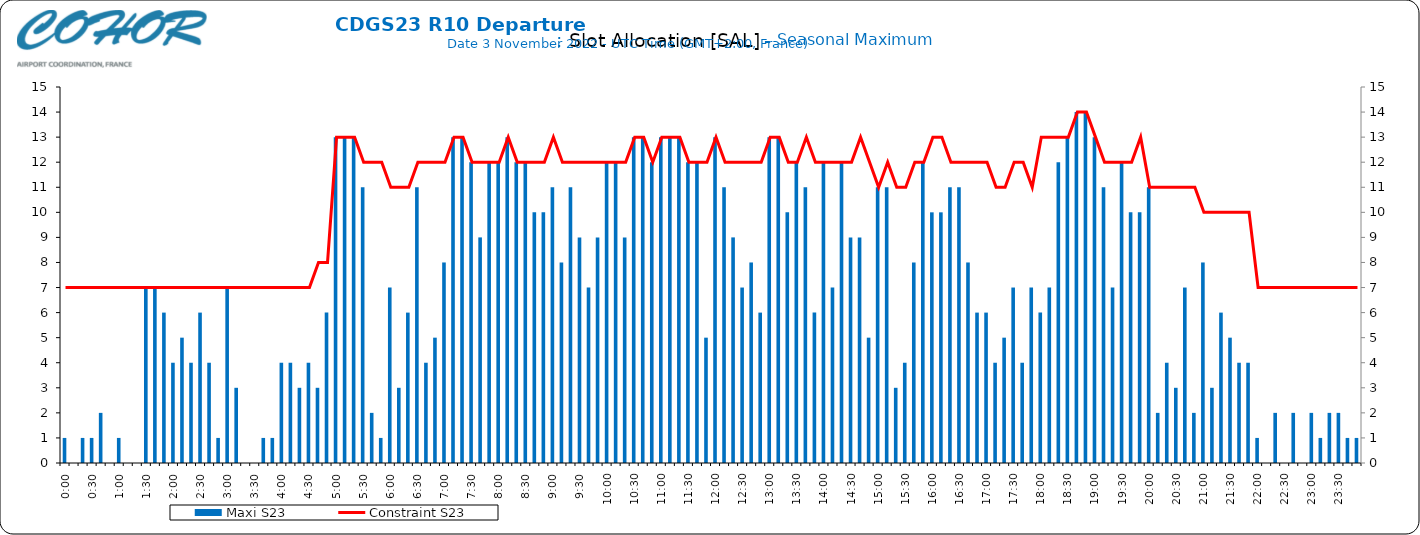
| Category | Maxi S23 |
|---|---|
| 0.0 | 1 |
| 0.006944444444444444 | 0 |
| 0.013888888888888888 | 1 |
| 0.020833333333333332 | 1 |
| 0.027777777777777776 | 2 |
| 0.034722222222222224 | 0 |
| 0.041666666666666664 | 1 |
| 0.04861111111111111 | 0 |
| 0.05555555555555555 | 0 |
| 0.0625 | 7 |
| 0.06944444444444443 | 7 |
| 0.0763888888888889 | 6 |
| 0.08333333333333333 | 4 |
| 0.09027777777777778 | 5 |
| 0.09722222222222222 | 4 |
| 0.10416666666666667 | 6 |
| 0.1111111111111111 | 4 |
| 0.11805555555555557 | 1 |
| 0.125 | 7 |
| 0.13194444444444445 | 3 |
| 0.1388888888888889 | 0 |
| 0.14583333333333334 | 0 |
| 0.15277777777777776 | 1 |
| 0.15972222222222224 | 1 |
| 0.16666666666666666 | 4 |
| 0.17361111111111113 | 4 |
| 0.18055555555555555 | 3 |
| 0.1875 | 4 |
| 0.19444444444444445 | 3 |
| 0.20138888888888887 | 6 |
| 0.20833333333333334 | 13 |
| 0.2152777777777778 | 13 |
| 0.2222222222222222 | 13 |
| 0.22916666666666666 | 11 |
| 0.23611111111111113 | 2 |
| 0.24305555555555555 | 1 |
| 0.25 | 7 |
| 0.2569444444444445 | 3 |
| 0.2638888888888889 | 6 |
| 0.2708333333333333 | 11 |
| 0.2777777777777778 | 4 |
| 0.2847222222222222 | 5 |
| 0.2916666666666667 | 8 |
| 0.2986111111111111 | 13 |
| 0.3055555555555555 | 13 |
| 0.3125 | 12 |
| 0.3194444444444445 | 9 |
| 0.3263888888888889 | 12 |
| 0.3333333333333333 | 12 |
| 0.34027777777777773 | 13 |
| 0.34722222222222227 | 12 |
| 0.3541666666666667 | 12 |
| 0.3611111111111111 | 10 |
| 0.3680555555555556 | 10 |
| 0.375 | 11 |
| 0.3819444444444444 | 8 |
| 0.3888888888888889 | 11 |
| 0.3958333333333333 | 9 |
| 0.40277777777777773 | 7 |
| 0.40972222222222227 | 9 |
| 0.4166666666666667 | 12 |
| 0.4236111111111111 | 12 |
| 0.4305555555555556 | 9 |
| 0.4375 | 13 |
| 0.4444444444444444 | 13 |
| 0.4513888888888889 | 12 |
| 0.4583333333333333 | 13 |
| 0.46527777777777773 | 13 |
| 0.47222222222222227 | 13 |
| 0.4791666666666667 | 12 |
| 0.4861111111111111 | 12 |
| 0.4930555555555556 | 5 |
| 0.5 | 13 |
| 0.5069444444444444 | 11 |
| 0.513888888888889 | 9 |
| 0.5208333333333334 | 7 |
| 0.5277777777777778 | 8 |
| 0.5347222222222222 | 6 |
| 0.5416666666666666 | 13 |
| 0.548611111111111 | 13 |
| 0.5555555555555556 | 10 |
| 0.5625 | 12 |
| 0.5694444444444444 | 11 |
| 0.576388888888889 | 6 |
| 0.5833333333333334 | 12 |
| 0.5902777777777778 | 7 |
| 0.5972222222222222 | 12 |
| 0.6041666666666666 | 9 |
| 0.611111111111111 | 9 |
| 0.6180555555555556 | 5 |
| 0.625 | 11 |
| 0.6319444444444444 | 11 |
| 0.638888888888889 | 3 |
| 0.6458333333333334 | 4 |
| 0.6527777777777778 | 8 |
| 0.6597222222222222 | 12 |
| 0.6666666666666666 | 10 |
| 0.6736111111111112 | 10 |
| 0.6805555555555555 | 11 |
| 0.6875 | 11 |
| 0.6944444444444445 | 8 |
| 0.7013888888888888 | 6 |
| 0.7083333333333334 | 6 |
| 0.7152777777777778 | 4 |
| 0.7222222222222222 | 5 |
| 0.7291666666666666 | 7 |
| 0.7361111111111112 | 4 |
| 0.7430555555555555 | 7 |
| 0.75 | 6 |
| 0.7569444444444445 | 7 |
| 0.7638888888888888 | 12 |
| 0.7708333333333334 | 13 |
| 0.7777777777777778 | 14 |
| 0.7847222222222222 | 14 |
| 0.7916666666666666 | 13 |
| 0.7986111111111112 | 11 |
| 0.8055555555555555 | 7 |
| 0.8125 | 12 |
| 0.8194444444444445 | 10 |
| 0.8263888888888888 | 10 |
| 0.8333333333333334 | 11 |
| 0.8402777777777778 | 2 |
| 0.8472222222222222 | 4 |
| 0.8541666666666666 | 3 |
| 0.8611111111111112 | 7 |
| 0.8680555555555555 | 2 |
| 0.875 | 8 |
| 0.8819444444444445 | 3 |
| 0.8888888888888888 | 6 |
| 0.8958333333333334 | 5 |
| 0.9027777777777778 | 4 |
| 0.9097222222222222 | 4 |
| 0.9166666666666666 | 1 |
| 0.9236111111111112 | 0 |
| 0.9305555555555555 | 2 |
| 0.9375 | 0 |
| 0.9444444444444445 | 2 |
| 0.9513888888888888 | 0 |
| 0.9583333333333334 | 2 |
| 0.9652777777777778 | 1 |
| 0.9722222222222222 | 2 |
| 0.9791666666666666 | 2 |
| 0.9861111111111112 | 1 |
| 0.9930555555555555 | 1 |